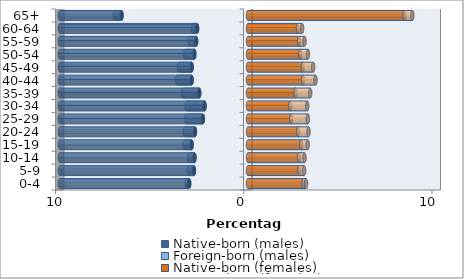
| Category | Native-born (males) | Foreign-born (males) | Native-born (females) | Foreign-born (females) |
|---|---|---|---|---|
| 0-4 | -3.124 | -0.128 | 2.956 | 0.129 |
| 5-9 | -2.872 | -0.258 | 2.729 | 0.256 |
| 10-14 | -2.843 | -0.3 | 2.712 | 0.29 |
| 15-19 | -2.994 | -0.359 | 2.828 | 0.345 |
| 20-24 | -2.818 | -0.546 | 2.67 | 0.545 |
| 25-29 | -2.397 | -0.869 | 2.3 | 0.879 |
| 30-34 | -2.308 | -0.947 | 2.247 | 0.902 |
| 35-39 | -2.589 | -0.861 | 2.528 | 0.777 |
| 40-44 | -2.992 | -0.773 | 2.924 | 0.661 |
| 45-49 | -2.991 | -0.666 | 2.914 | 0.548 |
| 50-54 | -2.848 | -0.496 | 2.779 | 0.408 |
| 55-59 | -2.754 | -0.339 | 2.715 | 0.287 |
| 60-64 | -2.702 | -0.219 | 2.657 | 0.217 |
| 65+ | -6.717 | -0.353 | 8.319 | 0.415 |